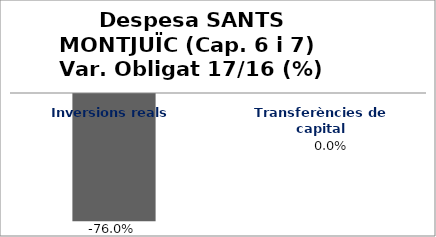
| Category | Series 0 |
|---|---|
| Inversions reals | -0.76 |
| Transferències de capital | 0 |